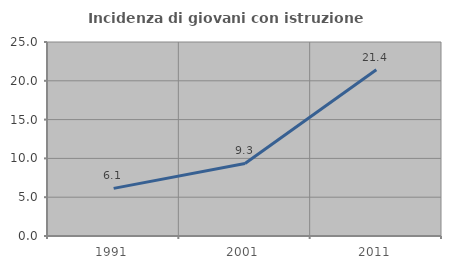
| Category | Incidenza di giovani con istruzione universitaria |
|---|---|
| 1991.0 | 6.14 |
| 2001.0 | 9.346 |
| 2011.0 | 21.429 |